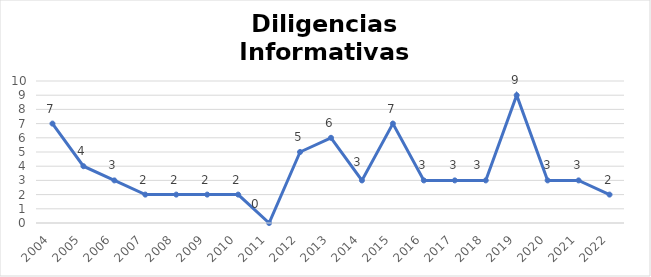
| Category | Diligencias Informativas |
|---|---|
| 2004.0 | 7 |
| 2005.0 | 4 |
| 2006.0 | 3 |
| 2007.0 | 2 |
| 2008.0 | 2 |
| 2009.0 | 2 |
| 2010.0 | 2 |
| 2011.0 | 0 |
| 2012.0 | 5 |
| 2013.0 | 6 |
| 2014.0 | 3 |
| 2015.0 | 7 |
| 2016.0 | 3 |
| 2017.0 | 3 |
| 2018.0 | 3 |
| 2019.0 | 9 |
| 2020.0 | 3 |
| 2021.0 | 3 |
| 2022.0 | 2 |